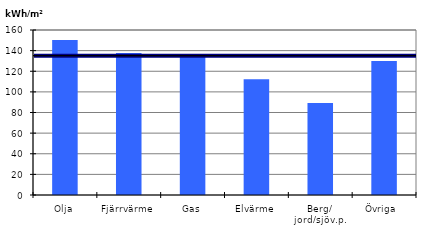
| Category | Genomsnitt per uppvärmningssätt (KWh/m2) |
|---|---|
| Olja | 150.41 |
| Fjärrvärme | 137.697 |
| Gas | 136.179 |
| Elvärme | 112.253 |
| Berg/ jord/sjöv.p. | 89.269 |
| Övriga  | 129.842 |